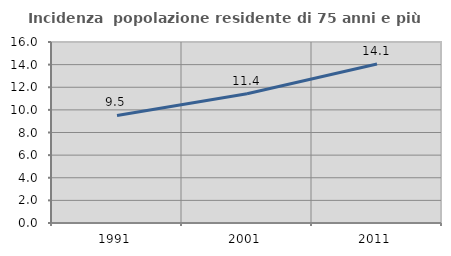
| Category | Incidenza  popolazione residente di 75 anni e più |
|---|---|
| 1991.0 | 9.504 |
| 2001.0 | 11.429 |
| 2011.0 | 14.062 |